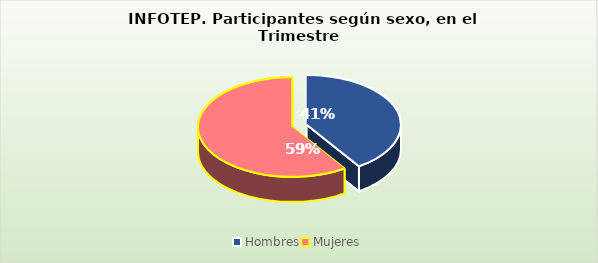
| Category | Series 0 |
|---|---|
| Hombres | 43889 |
| Mujeres | 64081 |